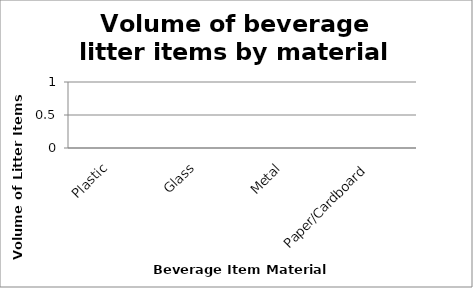
| Category | Series 0 |
|---|---|
| Plastic | 0 |
| Glass | 0 |
| Metal | 0 |
| Paper/Cardboard | 0 |